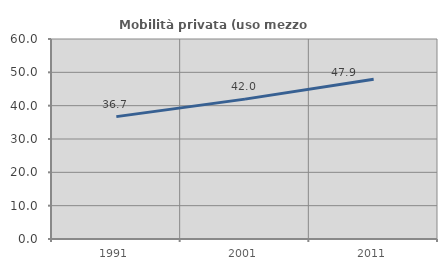
| Category | Mobilità privata (uso mezzo privato) |
|---|---|
| 1991.0 | 36.715 |
| 2001.0 | 41.961 |
| 2011.0 | 47.945 |